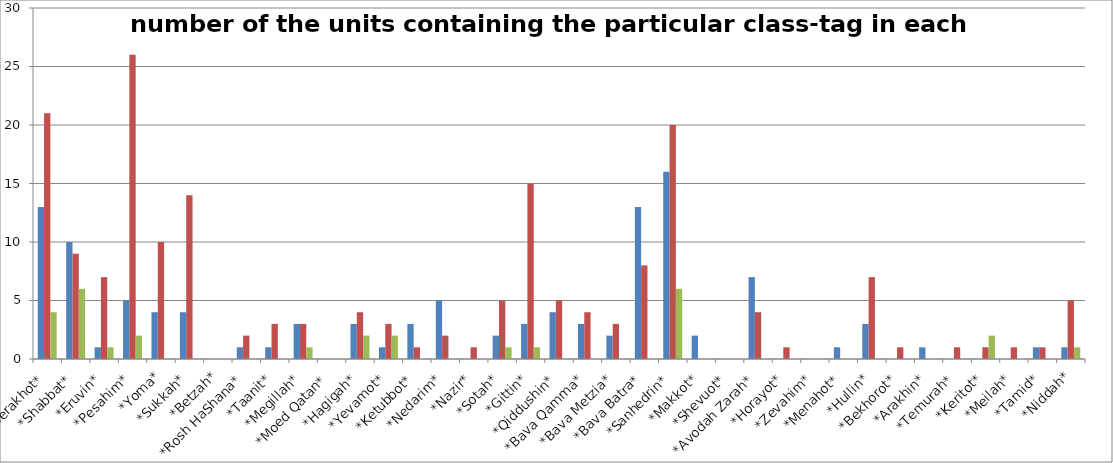
| Category | Series 0 | Series 1 | Series 2 |
|---|---|---|---|
| *Berakhot* | 13 | 21 | 4 |
| *Shabbat* | 10 | 9 | 6 |
| *Eruvin* | 1 | 7 | 1 |
| *Pesahim* | 5 | 26 | 2 |
| *Yoma* | 4 | 10 | 0 |
| *Sukkah* | 4 | 14 | 0 |
| *Betzah* | 0 | 0 | 0 |
| *Rosh HaShana* | 1 | 2 | 0 |
| *Taanit* | 1 | 3 | 0 |
| *Megillah* | 3 | 3 | 1 |
| *Moed Qatan* | 0 | 0 | 0 |
| *Hagigah* | 3 | 4 | 2 |
| *Yevamot* | 1 | 3 | 2 |
| *Ketubbot* | 3 | 1 | 0 |
| *Nedarim* | 5 | 2 | 0 |
| *Nazir* | 0 | 1 | 0 |
| *Sotah* | 2 | 5 | 1 |
| *Gittin* | 3 | 15 | 1 |
| *Qiddushin* | 4 | 5 | 0 |
| *Bava Qamma* | 3 | 4 | 0 |
| *Bava Metzia* | 2 | 3 | 0 |
| *Bava Batra* | 13 | 8 | 0 |
| *Sanhedrin* | 16 | 20 | 6 |
| *Makkot* | 2 | 0 | 0 |
| *Shevuot* | 0 | 0 | 0 |
| *Avodah Zarah* | 7 | 4 | 0 |
| *Horayot* | 0 | 1 | 0 |
| *Zevahim* | 0 | 0 | 0 |
| *Menahot* | 1 | 0 | 0 |
| *Hullin* | 3 | 7 | 0 |
| *Bekhorot* | 0 | 1 | 0 |
| *Arakhin* | 1 | 0 | 0 |
| *Temurah* | 0 | 1 | 0 |
| *Keritot* | 0 | 1 | 2 |
| *Meilah* | 0 | 1 | 0 |
| *Tamid* | 1 | 1 | 0 |
| *Niddah* | 1 | 5 | 1 |